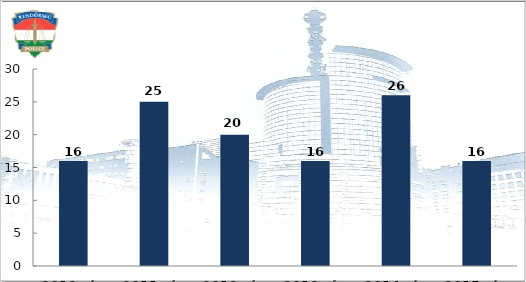
| Category | Súlyosan sérült személyek száma (fő) |
|---|---|
| 2010. év | 16 |
| 2011. év | 25 |
| 2012. év | 20 |
| 2013. év | 16 |
| 2014. év | 26 |
| 2015. év | 16 |